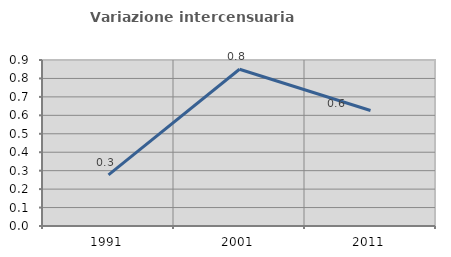
| Category | Variazione intercensuaria annua |
|---|---|
| 1991.0 | 0.277 |
| 2001.0 | 0.85 |
| 2011.0 | 0.626 |